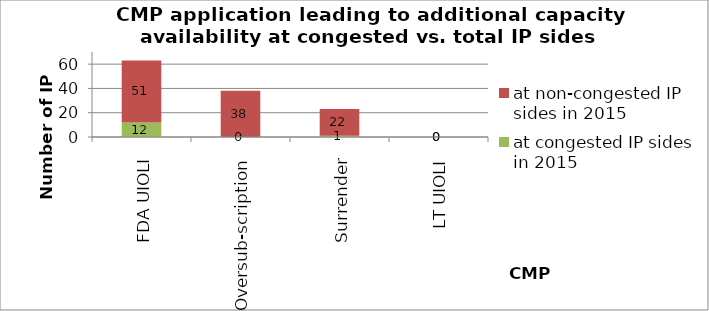
| Category | at congested IP sides in 2015 | at non-congested IP sides in 2015 |
|---|---|---|
| FDA UIOLI | 12 | 51 |
| Oversub-scription | 0 | 38 |
| Surrender | 1 | 22 |
| LT UIOLI | 0 | 0 |